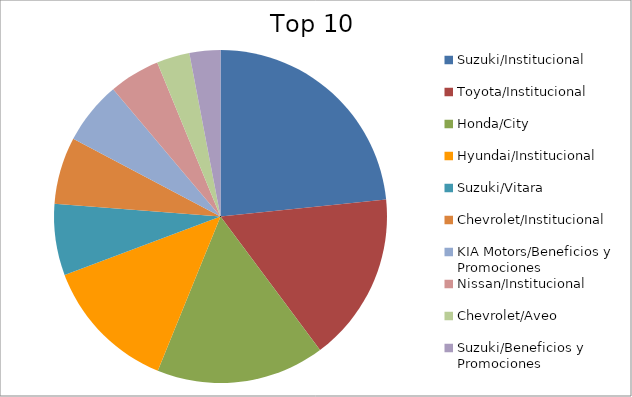
| Category | Series 0 |
|---|---|
| Suzuki/Institucional | 18.77 |
| Toyota/Institucional | 13.18 |
| Honda/City | 13.12 |
| Hyundai/Institucional | 10.55 |
| Suzuki/Vitara | 5.56 |
| Chevrolet/Institucional | 5.22 |
| KIA Motors/Beneficios y Promociones | 4.92 |
| Nissan/Institucional | 3.97 |
| Chevrolet/Aveo | 2.57 |
| Suzuki/Beneficios y Promociones | 2.41 |